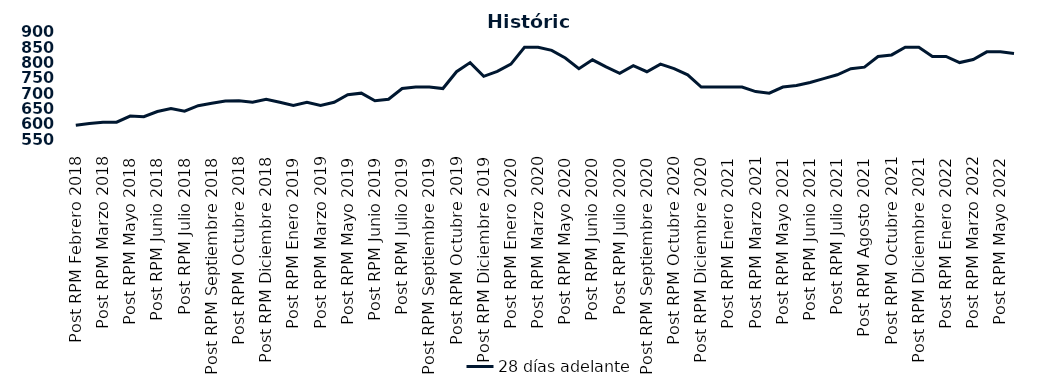
| Category | 28 días adelante |
|---|---|
| Post RPM Febrero 2018 | 595 |
| Pre RPM Marzo 2018 | 601 |
| Post RPM Marzo 2018 | 605 |
| Pre RPM Mayo 2018 | 605 |
| Post RPM Mayo 2018 | 625 |
| Pre RPM Junio 2018 | 623 |
| Post RPM Junio 2018 | 640 |
| Pre RPM Julio 2018 | 650 |
| Post RPM Julio 2018 | 641 |
| Pre RPM Septiembre 2018 | 659 |
| Post RPM Septiembre 2018 | 666.75 |
| Pre RPM Octubre 2018 | 674 |
| Post RPM Octubre 2018 | 675 |
| Pre RPM Diciembre 2018 | 670 |
| Post RPM Diciembre 2018 | 680 |
| Pre RPM Enero 2019 | 670 |
| Post RPM Enero 2019 | 660 |
| Pre RPM Marzo 2019 | 670 |
| Post RPM Marzo 2019 | 660 |
| Pre RPM Mayo 2019 | 670 |
| Post RPM Mayo 2019 | 695 |
| Pre RPM Junio 2019 | 700 |
| Post RPM Junio 2019 | 675 |
| Pre RPM Julio 2019 | 680 |
| Post RPM Julio 2019 | 715 |
| Pre RPM Septiembre 2019 | 720 |
| Post RPM Septiembre 2019 | 720 |
| Pre RPM Octubre 2019 | 715 |
| Post RPM Octubre 2019 | 770 |
| Pre RPM Diciembre 2019 | 800 |
| Post RPM Diciembre 2019 | 755 |
| Pre RPM Enero 2020 | 771 |
| Post RPM Enero 2020 | 795 |
| Pre RPM Marzo 2020 | 850 |
| Post RPM Marzo 2020 | 850 |
| Pre RPM Mayo 2020 | 840 |
| Post RPM Mayo 2020 | 815 |
| Pre RPM Junio 2020 | 780 |
| Post RPM Junio 2020 | 809 |
| Pre RPM Julio 2020 | 785.72 |
| Post RPM Julio 2020 | 765 |
| Pre RPM Septiembre 2020 | 790 |
| Post RPM Septiembre 2020 | 770 |
| Pre RPM Octubre 2020 | 795 |
| Post RPM Octubre 2020 | 780 |
| Pre RPM Diciembre 2020 | 760 |
| Post RPM Diciembre 2020 | 720 |
| Pre RPM Enero 2021 | 720 |
| Post RPM Enero 2021 | 720 |
| Pre RPM Marzo 2021 | 720 |
| Post RPM Marzo 2021 | 705 |
| Pre RPM Mayo 2021 | 700 |
| Post RPM Mayo 2021 | 720 |
| Pre RPM Junio 2021 | 725 |
| Post RPM Junio 2021 | 735 |
| Pre RPM Julio 2021 | 747.5 |
| Post RPM Julio 2021 | 760 |
| Pre RPM Agosto 2021 | 780 |
| Post RPM Agosto 2021 | 785 |
| Pre RPM Octubre 2021 | 820 |
| Post RPM Octubre 2021 | 825 |
| Pre RPM Diciembre 2021 | 850 |
| Post RPM Diciembre 2021 | 850 |
| Pre RPM Enero 2022 | 820 |
| Post RPM Enero 2022 | 820 |
| Pre RPM Marzo 2022 | 800 |
| Post RPM Marzo 2022 | 810 |
| Pre RPM Mayo 2022 | 835 |
| Post RPM Mayo 2022 | 835 |
| Pre RPM Junio 2022 | 830 |